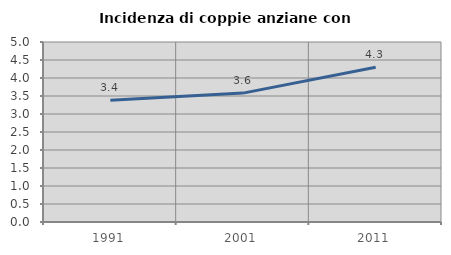
| Category | Incidenza di coppie anziane con figli |
|---|---|
| 1991.0 | 3.383 |
| 2001.0 | 3.58 |
| 2011.0 | 4.301 |